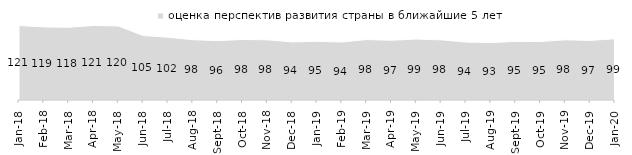
| Category | оценка перспектив развития страны в ближайшие 5 лет |
|---|---|
| 2018-01-01 | 120.9 |
| 2018-02-01 | 118.65 |
| 2018-03-01 | 118.1 |
| 2018-04-01 | 121 |
| 2018-05-01 | 120.15 |
| 2018-06-01 | 104.6 |
| 2018-07-01 | 101.85 |
| 2018-08-01 | 97.85 |
| 2018-09-01 | 96.4 |
| 2018-10-01 | 98.25 |
| 2018-11-01 | 97.705 |
| 2018-12-01 | 94.3 |
| 2019-01-01 | 95.25 |
| 2019-02-01 | 94.05 |
| 2019-03-01 | 98.11 |
| 2019-04-01 | 97.03 |
| 2019-05-01 | 98.91 |
| 2019-06-01 | 97.656 |
| 2019-07-01 | 94.01 |
| 2019-08-01 | 93.207 |
| 2019-09-01 | 95.099 |
| 2019-10-01 | 95 |
| 2019-11-01 | 97.673 |
| 2019-12-01 | 96.733 |
| 2020-01-01 | 99.356 |